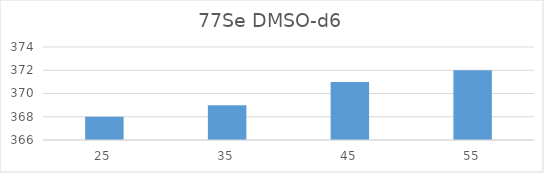
| Category | 77Se DMSO |
|---|---|
| 25.0 | 368 |
| 35.0 | 369 |
| 45.0 | 371 |
| 55.0 | 372 |